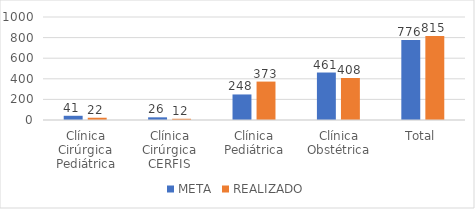
| Category | META | REALIZADO |
|---|---|---|
| Clínica Cirúrgica Pediátrica | 41 | 22 |
| Clínica Cirúrgica CERFIS | 26 | 12 |
| Clínica Pediátrica | 248 | 373 |
| Clínica Obstétrica | 461 | 408 |
| Total | 776 | 815 |